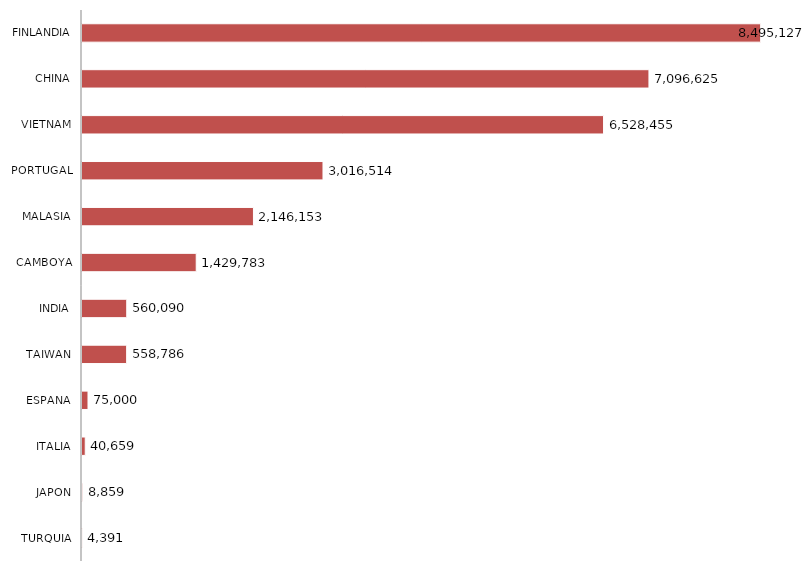
| Category | Series 0 |
|---|---|
| TURQUIA | 4391.13 |
| JAPON | 8859.31 |
| ITALIA | 40658.8 |
| ESPANA | 74999.85 |
| TAIWAN | 558785.88 |
| INDIA | 560089.87 |
| CAMBOYA | 1429782.76 |
| MALASIA | 2146153.07 |
| PORTUGAL | 3016513.59 |
| VIETNAM | 6528454.79 |
| CHINA | 7096624.5 |
| FINLANDIA | 8495127.02 |